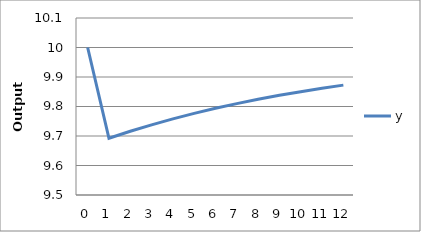
| Category | y |
|---|---|
| 0.0 | 10 |
| 1.0 | 9.692 |
| 2.0 | 9.716 |
| 3.0 | 9.738 |
| 4.0 | 9.758 |
| 5.0 | 9.777 |
| 6.0 | 9.794 |
| 7.0 | 9.81 |
| 8.0 | 9.824 |
| 9.0 | 9.838 |
| 10.0 | 9.85 |
| 11.0 | 9.862 |
| 12.0 | 9.872 |